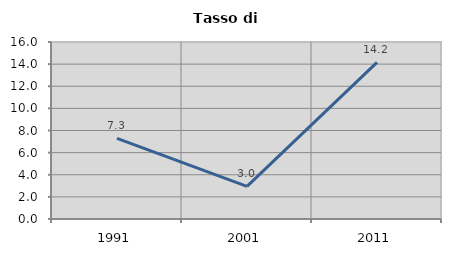
| Category | Tasso di disoccupazione   |
|---|---|
| 1991.0 | 7.28 |
| 2001.0 | 2.953 |
| 2011.0 | 14.164 |